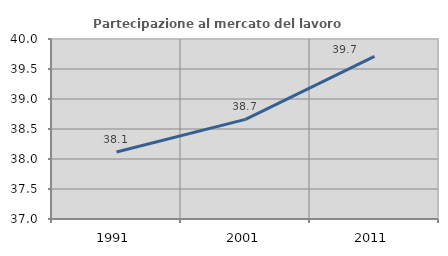
| Category | Partecipazione al mercato del lavoro  femminile |
|---|---|
| 1991.0 | 38.117 |
| 2001.0 | 38.661 |
| 2011.0 | 39.712 |